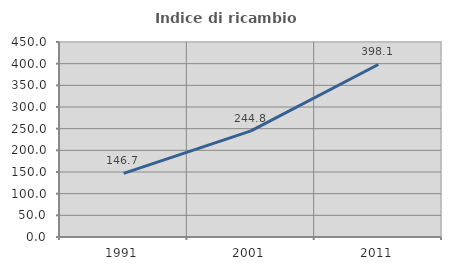
| Category | Indice di ricambio occupazionale  |
|---|---|
| 1991.0 | 146.667 |
| 2001.0 | 244.776 |
| 2011.0 | 398.113 |